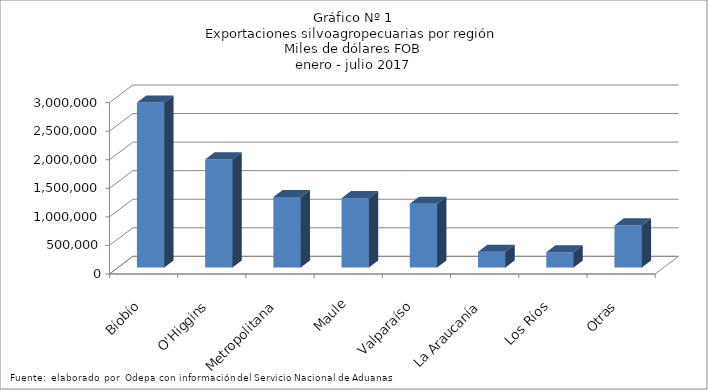
| Category | Series 0 |
|---|---|
| Bíobío | 2890252.02 |
| O'Higgins | 1893194.518 |
| Metropolitana | 1234026.812 |
| Maule | 1214911.614 |
| Valparaíso | 1115918.819 |
| La Araucanía | 276756.951 |
| Los Ríos | 267531.828 |
| Otras | 737263.703 |